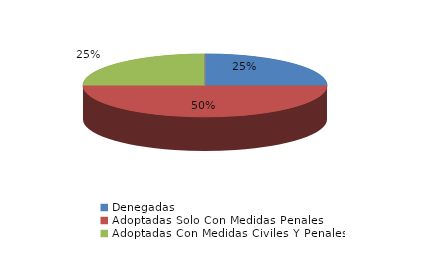
| Category | Series 0 |
|---|---|
| Denegadas | 1 |
| Adoptadas Solo Con Medidas Penales | 2 |
| Adoptadas Con Medidas Civiles Y Penales | 1 |
| Adoptadas Con Medidas Solo Civiles | 0 |